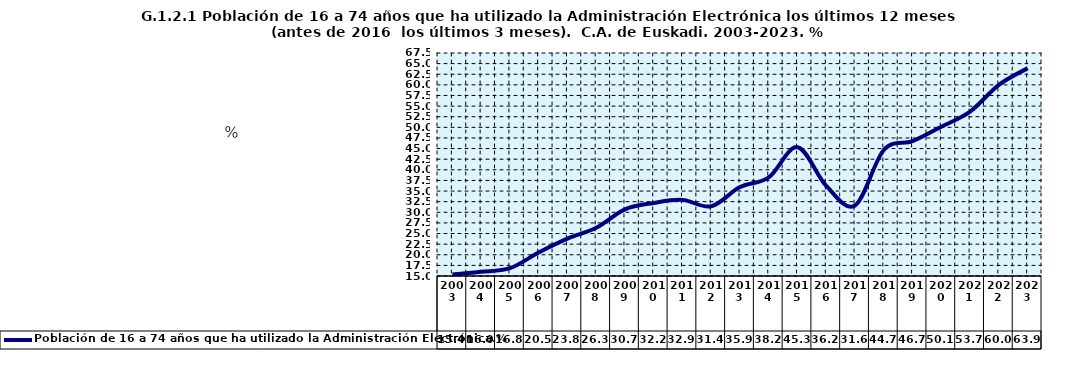
| Category | Población de 16 a 74 años que ha utilizado la Administración Electrónica.% |
|---|---|
| 2003.0 | 15.375 |
| 2004.0 | 15.991 |
| 2005.0 | 16.831 |
| 2006.0 | 20.537 |
| 2007.0 | 23.794 |
| 2008.0 | 26.338 |
| 2009.0 | 30.694 |
| 2010.0 | 32.207 |
| 2011.0 | 32.922 |
| 2012.0 | 31.411 |
| 2013.0 | 35.945 |
| 2014.0 | 38.224 |
| 2015.0 | 45.329 |
| 2016.0 | 36.231 |
| 2017.0 | 31.608 |
| 2018.0 | 44.663 |
| 2019.0 | 46.748 |
| 2020.0 | 50.139 |
| 2021.0 | 53.699 |
| 2022.0 | 59.995 |
| 2023.0 | 63.927 |